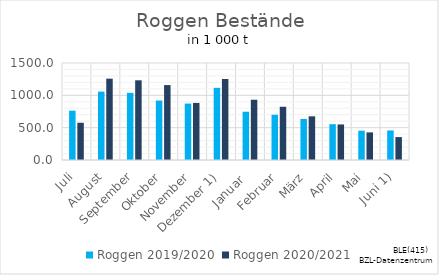
| Category | Roggen |
|---|---|
| Juli | 575.969 |
| August | 1257.71 |
| September | 1232.552 |
| Oktober | 1158.822 |
| November | 882.295 |
| Dezember 1) | 1253.04 |
| Januar  | 931.825 |
| Februar | 823.189 |
| März | 675.327 |
| April | 549.968 |
| Mai | 427.185 |
| Juni 1) | 354.61 |